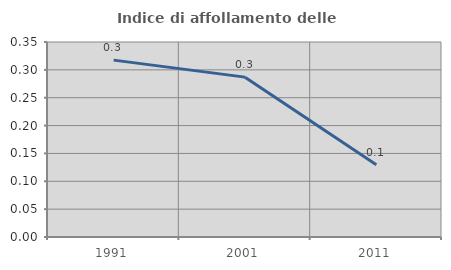
| Category | Indice di affollamento delle abitazioni  |
|---|---|
| 1991.0 | 0.317 |
| 2001.0 | 0.287 |
| 2011.0 | 0.13 |